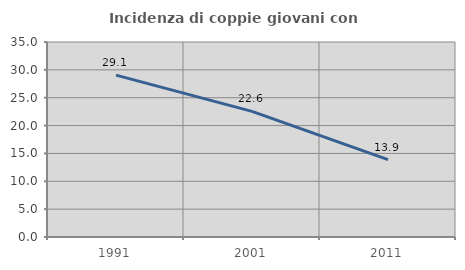
| Category | Incidenza di coppie giovani con figli |
|---|---|
| 1991.0 | 29.051 |
| 2001.0 | 22.552 |
| 2011.0 | 13.895 |